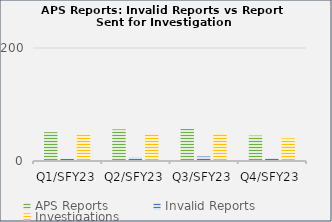
| Category | APS Reports | Invalid Reports | Investigations |
|---|---|---|---|
| Q1/SFY23 | 51 | 4 | 47 |
| Q2/SFY23 | 56 | 7 | 49 |
| Q3/SFY23 | 57 | 8 | 49 |
| Q4/SFY23 | 45 | 5 | 40 |